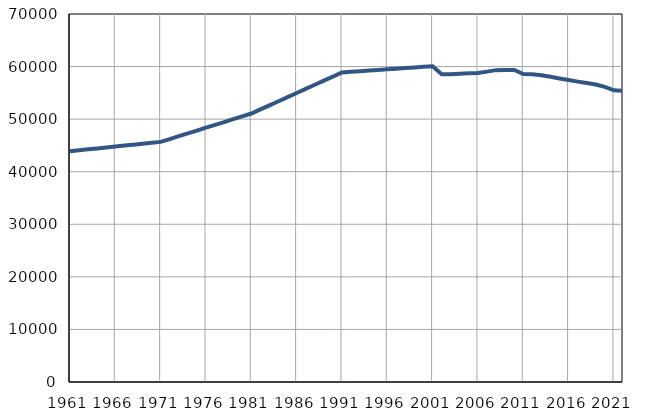
| Category | Број
становника |
|---|---|
| 1961.0 | 43906 |
| 1962.0 | 44083 |
| 1963.0 | 44260 |
| 1964.0 | 44437 |
| 1965.0 | 44614 |
| 1966.0 | 44790 |
| 1967.0 | 44967 |
| 1968.0 | 45144 |
| 1969.0 | 45321 |
| 1970.0 | 45498 |
| 1971.0 | 45675 |
| 1972.0 | 46214 |
| 1973.0 | 46754 |
| 1974.0 | 47293 |
| 1975.0 | 47832 |
| 1976.0 | 48372 |
| 1977.0 | 48911 |
| 1978.0 | 49450 |
| 1979.0 | 49989 |
| 1980.0 | 50529 |
| 1981.0 | 51068 |
| 1982.0 | 51849 |
| 1983.0 | 52631 |
| 1984.0 | 53411 |
| 1985.0 | 54194 |
| 1986.0 | 54975 |
| 1987.0 | 55756 |
| 1988.0 | 56538 |
| 1989.0 | 57319 |
| 1990.0 | 58101 |
| 1991.0 | 58882 |
| 1992.0 | 59001 |
| 1993.0 | 59120 |
| 1994.0 | 59238 |
| 1995.0 | 59357 |
| 1996.0 | 59476 |
| 1997.0 | 59595 |
| 1998.0 | 59714 |
| 1999.0 | 59833 |
| 2000.0 | 59951 |
| 2001.0 | 60070 |
| 2002.0 | 58537 |
| 2003.0 | 58540 |
| 2004.0 | 58638 |
| 2005.0 | 58717 |
| 2006.0 | 58764 |
| 2007.0 | 59043 |
| 2008.0 | 59322 |
| 2009.0 | 59364 |
| 2010.0 | 59366 |
| 2011.0 | 58596 |
| 2012.0 | 58523 |
| 2013.0 | 58352 |
| 2014.0 | 58049 |
| 2015.0 | 57735 |
| 2016.0 | 57444 |
| 2017.0 | 57136 |
| 2018.0 | 56865 |
| 2019.0 | 56595 |
| 2020.0 | 56125 |
| 2021.0 | 55477 |
| 2022.0 | 55366 |